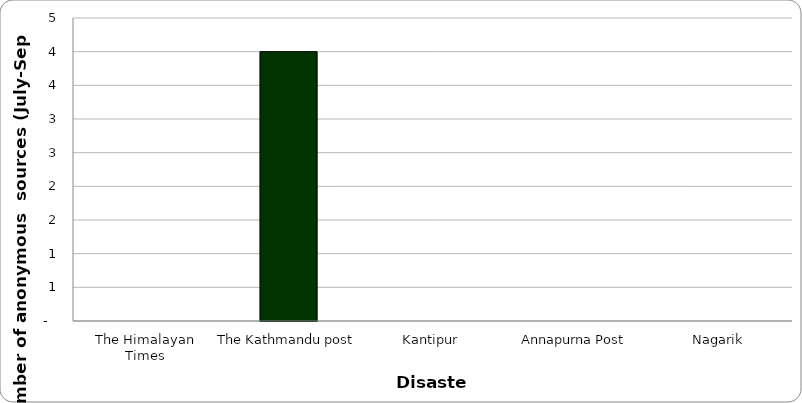
| Category | Disaster |
|---|---|
| The Himalayan Times | 0 |
| The Kathmandu post | 4 |
| Kantipur | 0 |
| Annapurna Post | 0 |
| Nagarik | 0 |